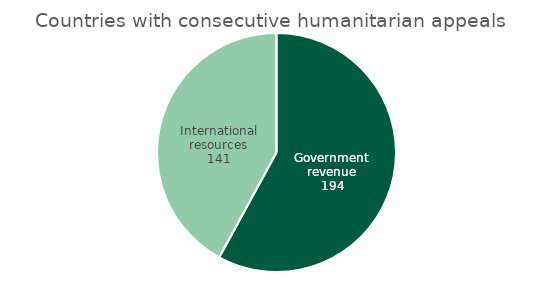
| Category | Series 0 |
|---|---|
| Government revenue | 194.289 |
| International resources | 140.967 |